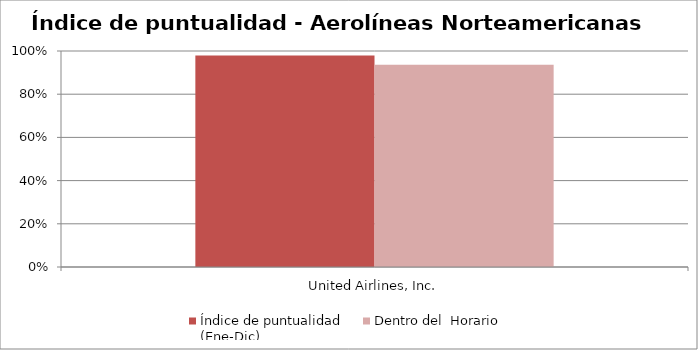
| Category | Índice de puntualidad
(Ene-Dic) | Dentro del  Horario |
|---|---|---|
| United Airlines, Inc. | 0.979 | 0.936 |